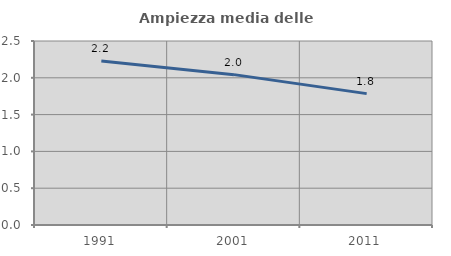
| Category | Ampiezza media delle famiglie |
|---|---|
| 1991.0 | 2.227 |
| 2001.0 | 2.043 |
| 2011.0 | 1.785 |